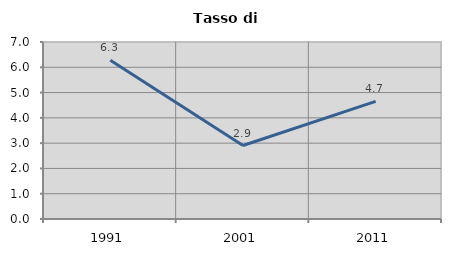
| Category | Tasso di disoccupazione   |
|---|---|
| 1991.0 | 6.276 |
| 2001.0 | 2.905 |
| 2011.0 | 4.654 |